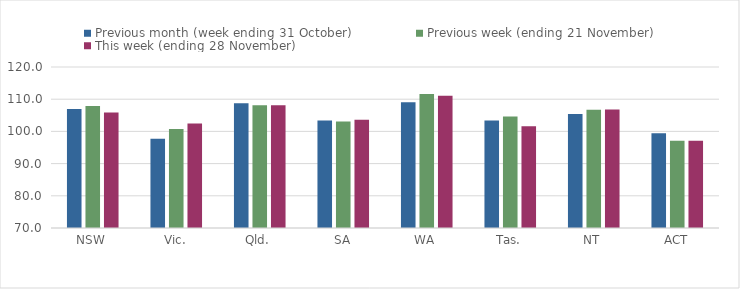
| Category | Previous month (week ending 31 October) | Previous week (ending 21 November) | This week (ending 28 November) |
|---|---|---|---|
| NSW | 106.95 | 107.86 | 105.88 |
| Vic. | 97.74 | 100.77 | 102.45 |
| Qld. | 108.73 | 108.15 | 108.15 |
| SA | 103.39 | 103.08 | 103.61 |
| WA | 109.04 | 111.59 | 111.05 |
| Tas. | 103.36 | 104.66 | 101.59 |
| NT | 105.42 | 106.72 | 106.79 |
| ACT | 99.45 | 97.12 | 97.12 |